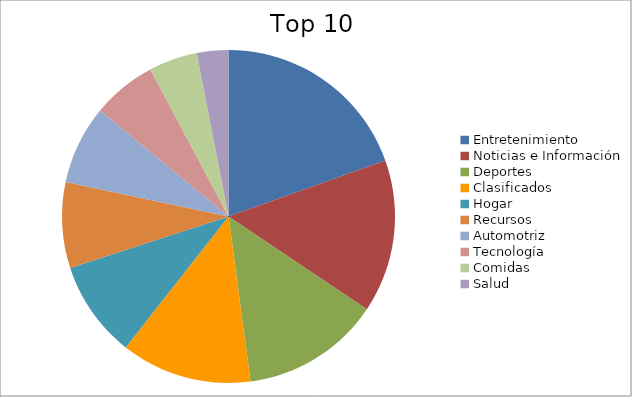
| Category | Series 0 |
|---|---|
| Entretenimiento | 17.05 |
| Noticias e Información | 12.96 |
| Deportes | 11.77 |
| Clasificados | 11.09 |
| Hogar | 8.19 |
| Recursos | 7.27 |
| Automotriz | 6.69 |
| Tecnología | 5.45 |
| Comidas | 4.11 |
| Salud | 2.67 |